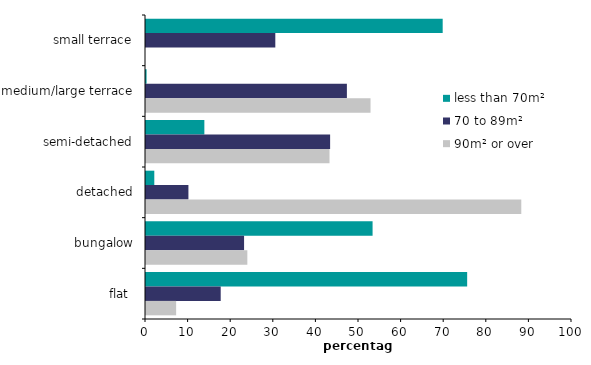
| Category | less than 70m² | 70 to 89m² | 90m² or over |
|---|---|---|---|
| small terrace | 69.645 | 30.355 | 0 |
| medium/large terrace | 0.137 | 47.158 | 52.705 |
| semi-detached | 13.699 | 43.221 | 43.08 |
| detached | 1.948 | 9.958 | 88.094 |
| bungalow | 53.188 | 23.023 | 23.788 |
| flat  | 75.39 | 17.537 | 7.073 |